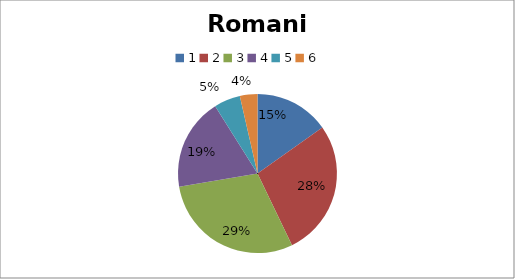
| Category | Romania |
|---|---|
| 0 | 17 |
| 1 | 31 |
| 2 | 33 |
| 3 | 21 |
| 4 | 6 |
| 5 | 4 |